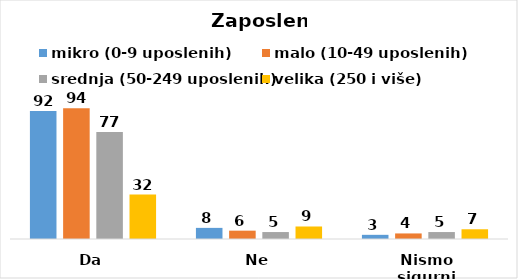
| Category | mikro (0-9 uposlenih) | malo (10-49 uposlenih) | srednja (50-249 uposlenih) | velika (250 i više) |
|---|---|---|---|---|
| Da | 92 | 94 | 77 | 32 |
| Ne | 8 | 6 | 5 | 9 |
| Nismo sigurni | 3 | 4 | 5 | 7 |